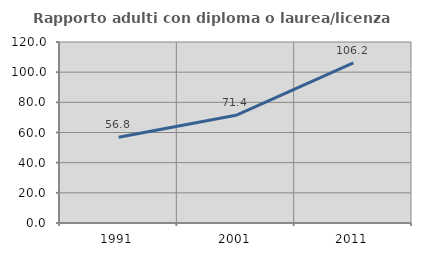
| Category | Rapporto adulti con diploma o laurea/licenza media  |
|---|---|
| 1991.0 | 56.805 |
| 2001.0 | 71.429 |
| 2011.0 | 106.195 |